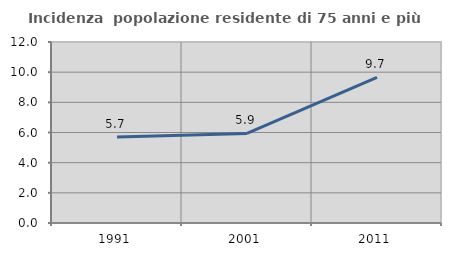
| Category | Incidenza  popolazione residente di 75 anni e più |
|---|---|
| 1991.0 | 5.698 |
| 2001.0 | 5.939 |
| 2011.0 | 9.651 |